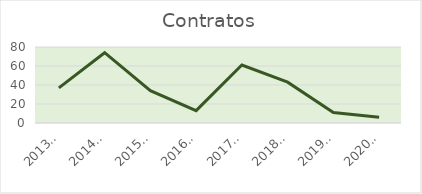
| Category | Contratos |
|---|---|
| 2013/14 | 37 |
| 2014/15 | 74 |
| 2015/16 | 34 |
| 2016/17 | 13 |
| 2017/18 | 61 |
| 2018/19 | 43 |
| 2019/20 | 11 |
| 2020/21 | 6 |